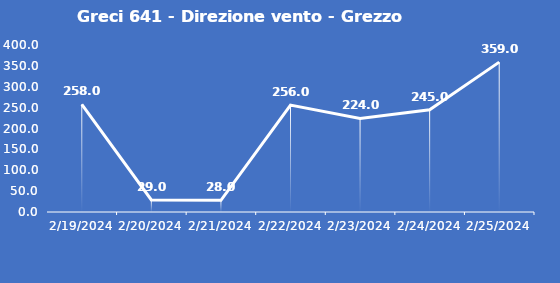
| Category | Greci 641 - Direzione vento - Grezzo (°N) |
|---|---|
| 2/19/24 | 258 |
| 2/20/24 | 29 |
| 2/21/24 | 28 |
| 2/22/24 | 256 |
| 2/23/24 | 224 |
| 2/24/24 | 245 |
| 2/25/24 | 359 |